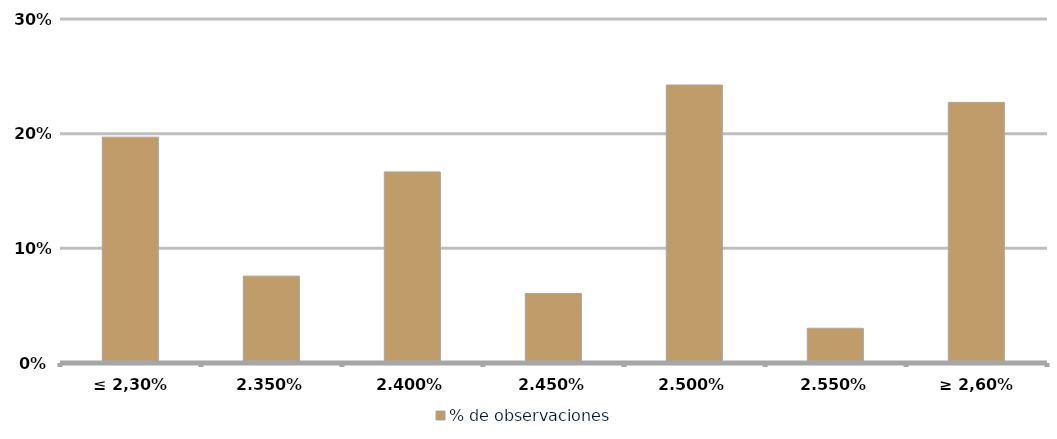
| Category | % de observaciones  |
|---|---|
| ≤ 2,30% | 0.197 |
| 2,35% | 0.076 |
| 2,40% | 0.167 |
| 2,45% | 0.061 |
| 2,50% | 0.242 |
| 2,55% | 0.03 |
| ≥ 2,60% | 0.227 |